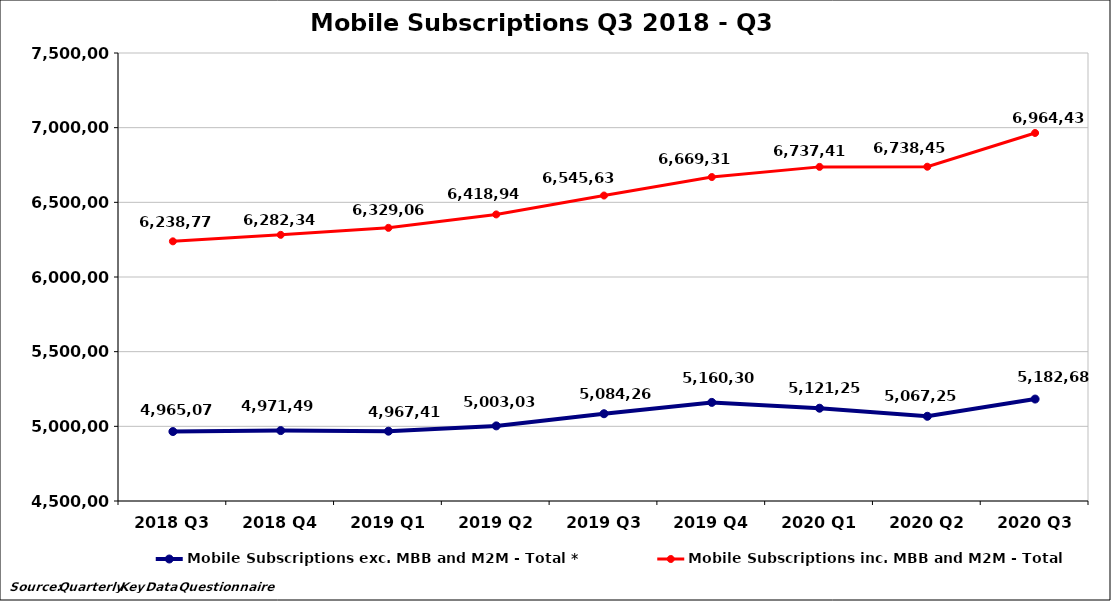
| Category | Mobile Subscriptions exc. MBB and M2M - Total * | Mobile Subscriptions inc. MBB and M2M - Total |
|---|---|---|
| 2018 Q3 | 4965077 | 6238772 |
| 2018 Q4 | 4971493 | 6282346 |
| 2019 Q1 | 4967414 | 6329068 |
| 2019 Q2 | 5003030 | 6418948 |
| 2019 Q3 | 5084265 | 6545636 |
| 2019 Q4 | 5160309 | 6669317 |
| 2020 Q1 | 5121253 | 6737414 |
| 2020 Q2 | 5067250 | 6738457 |
| 2020 Q3 | 5182682 | 6964436 |